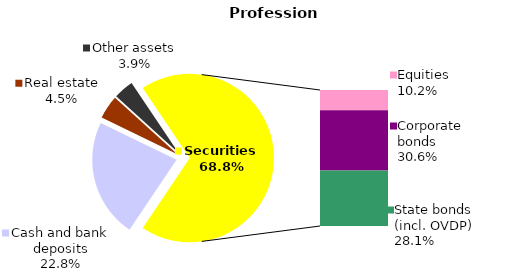
| Category | Professional |
|---|---|
| Cash and bank deposits | 25481886.83 |
| Bank metals | 0 |
| Real estate | 5050938.84 |
| Other assets | 4317700.27 |
| Equities | 11409460.367 |
| Corporate bonds | 34188083.063 |
| Municipal bonds | 0 |
| State bonds (incl. OVDP) | 31425845.36 |